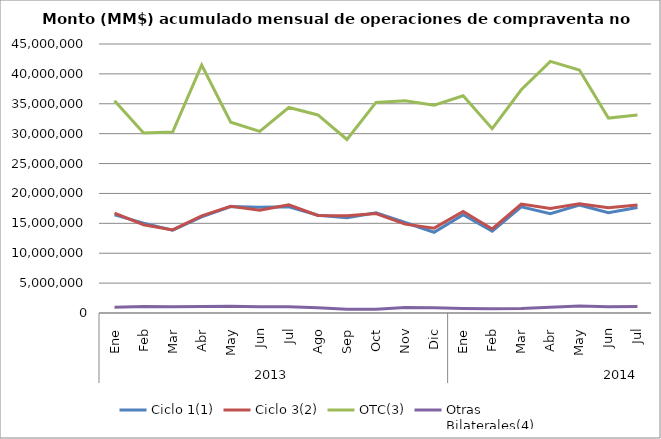
| Category | Ciclo 1(1) | Ciclo 3(2) | OTC(3) | Otras
Bilaterales(4) |
|---|---|---|---|---|
| 0 | 16417241.727 | 16700335.202 | 35523809.408 | 972958.086 |
| 1 | 15037741.172 | 14773657.586 | 30102338.851 | 1073496.596 |
| 2 | 13848943.779 | 13900402.205 | 30273669.122 | 1026617.054 |
| 3 | 16086096.035 | 16245696.168 | 41465554.082 | 1105720.368 |
| 4 | 17801790.619 | 17838763.351 | 31909646.654 | 1133512.85 |
| 5 | 17684542.956 | 17179330.609 | 30372188.279 | 1025162.543 |
| 6 | 17771623.451 | 18089502.524 | 34376831.202 | 1053340.718 |
| 7 | 16359818.954 | 16327115.519 | 33128143.288 | 882723.558 |
| 8 | 15949862.744 | 16281684.387 | 29025705.039 | 624893.462 |
| 9 | 16760948.703 | 16634867.291 | 35234004.542 | 641647.876 |
| 10 | 15133528.556 | 14863555.208 | 35512550.02 | 915020.525 |
| 11 | 13509827.678 | 14192849.668 | 34769513.126 | 877765.247 |
| 12 | 16434121.823 | 16973216.875 | 36341658.718 | 750147.378 |
| 13 | 13675521.943 | 14060199.134 | 30828680.35 | 721919.806 |
| 14 | 17760484.117 | 18231676.991 | 37344676.439 | 768460.999 |
| 15 | 16615436.994 | 17468955.339 | 42094978.158 | 945494.284 |
| 16 | 18046213.572 | 18258193.447 | 40638812.154 | 1185202.419 |
| 17 | 16777760.924 | 17604169.829 | 32614242.011 | 1051618.708 |
| 18 | 17653207.737 | 18067976.125 | 33107498.911 | 1069963.521 |